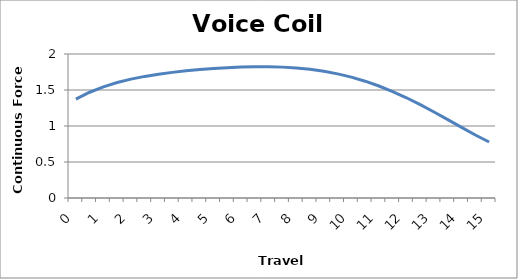
| Category | Series 0 |
|---|---|
| 0.0 | 1.374 |
| 0.5 | 1.469 |
| 1.0 | 1.544 |
| 1.5 | 1.604 |
| 2.0 | 1.651 |
| 2.5 | 1.689 |
| 3.0 | 1.72 |
| 3.5 | 1.745 |
| 4.0 | 1.766 |
| 4.5 | 1.783 |
| 5.0 | 1.798 |
| 5.5 | 1.81 |
| 6.0 | 1.818 |
| 6.5 | 1.823 |
| 7.0 | 1.823 |
| 7.5 | 1.818 |
| 8.0 | 1.806 |
| 8.5 | 1.787 |
| 9.0 | 1.76 |
| 9.5 | 1.724 |
| 10.0 | 1.678 |
| 10.5 | 1.622 |
| 11.0 | 1.556 |
| 11.5 | 1.479 |
| 12.0 | 1.392 |
| 12.5 | 1.297 |
| 13.0 | 1.195 |
| 13.5 | 1.089 |
| 14.0 | 0.981 |
| 14.5 | 0.875 |
| 15.0 | 0.777 |